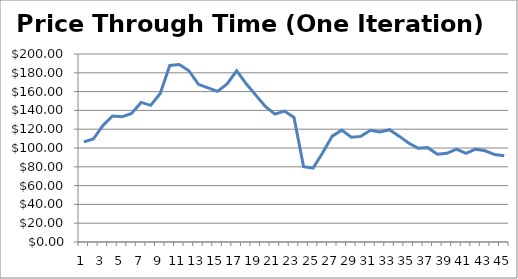
| Category | Series 0 |
|---|---|
| 0 | 106.49 |
| 1 | 109.577 |
| 2 | 123.853 |
| 3 | 134.034 |
| 4 | 133.137 |
| 5 | 136.672 |
| 6 | 148.504 |
| 7 | 145.395 |
| 8 | 157.92 |
| 9 | 187.775 |
| 10 | 188.813 |
| 11 | 182.194 |
| 12 | 167.704 |
| 13 | 164.014 |
| 14 | 160.28 |
| 15 | 168.194 |
| 16 | 182.15 |
| 17 | 168.267 |
| 18 | 156.24 |
| 19 | 144.164 |
| 20 | 136.105 |
| 21 | 139.278 |
| 22 | 132.576 |
| 23 | 80.183 |
| 24 | 78.717 |
| 25 | 94.91 |
| 26 | 112.64 |
| 27 | 119.019 |
| 28 | 111.464 |
| 29 | 112.373 |
| 30 | 118.841 |
| 31 | 117.077 |
| 32 | 119.475 |
| 33 | 112.624 |
| 34 | 105.268 |
| 35 | 99.708 |
| 36 | 100.374 |
| 37 | 93.356 |
| 38 | 94.332 |
| 39 | 98.766 |
| 40 | 94.321 |
| 41 | 98.746 |
| 42 | 96.998 |
| 43 | 93.019 |
| 44 | 91.688 |